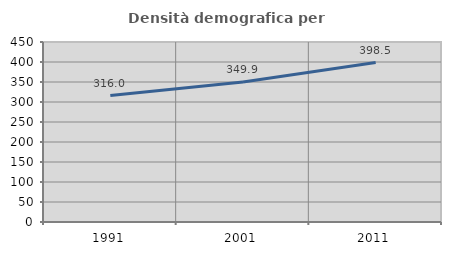
| Category | Densità demografica |
|---|---|
| 1991.0 | 315.982 |
| 2001.0 | 349.935 |
| 2011.0 | 398.509 |